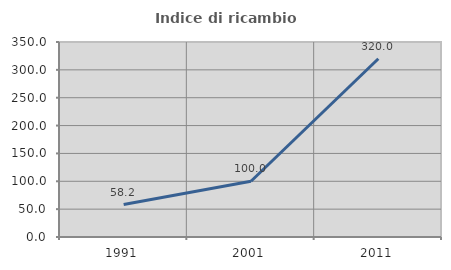
| Category | Indice di ricambio occupazionale  |
|---|---|
| 1991.0 | 58.209 |
| 2001.0 | 100 |
| 2011.0 | 320 |